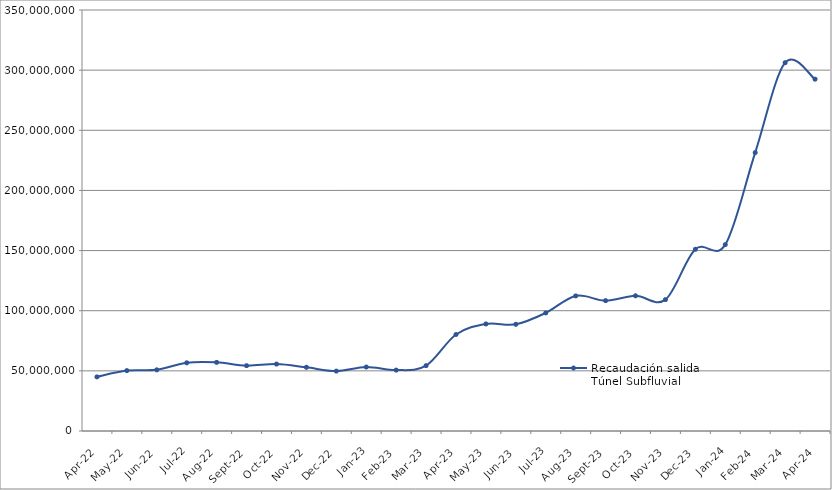
| Category | Recaudación salida
Túnel Subfluvial |
|---|---|
| 2022-04-01 | 44997360 |
| 2022-05-01 | 50200280 |
| 2022-06-01 | 50863000 |
| 2022-07-01 | 56699350 |
| 2022-08-01 | 57052650 |
| 2022-09-01 | 54320950 |
| 2022-10-01 | 55644300 |
| 2022-11-01 | 52951900 |
| 2022-12-01 | 49805950 |
| 2023-01-01 | 53167800 |
| 2023-02-01 | 50624850 |
| 2023-03-01 | 54331600 |
| 2023-04-01 | 80222800 |
| 2023-05-01 | 89000700 |
| 2023-06-01 | 88713700 |
| 2023-07-01 | 98166850 |
| 2023-08-01 | 112302600 |
| 2023-09-01 | 108372900 |
| 2023-10-01 | 112407500 |
| 2023-11-01 | 109213700 |
| 2023-12-01 | 151065300 |
| 2024-01-01 | 154941500 |
| 2024-02-01 | 231476700 |
| 2024-03-01 | 306194800 |
| 2024-04-01 | 292501200 |